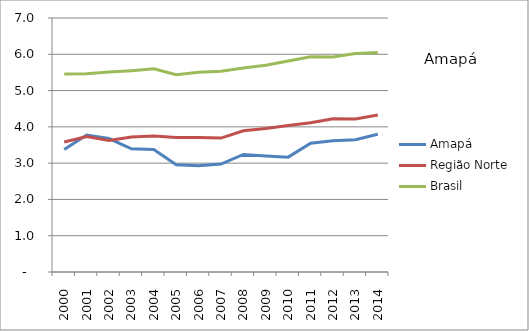
| Category | Amapá | Região Norte | Brasil |
|---|---|---|---|
| 2000.0 | 3.377 | 3.584 | 5.458 |
| 2001.0 | 3.777 | 3.732 | 5.467 |
| 2002.0 | 3.678 | 3.625 | 5.513 |
| 2003.0 | 3.394 | 3.72 | 5.549 |
| 2004.0 | 3.373 | 3.745 | 5.599 |
| 2005.0 | 2.957 | 3.709 | 5.438 |
| 2006.0 | 2.928 | 3.704 | 5.507 |
| 2007.0 | 2.974 | 3.69 | 5.531 |
| 2008.0 | 3.241 | 3.894 | 5.623 |
| 2009.0 | 3.197 | 3.953 | 5.699 |
| 2010.0 | 3.165 | 4.037 | 5.816 |
| 2011.0 | 3.551 | 4.116 | 5.93 |
| 2012.0 | 3.618 | 4.224 | 5.928 |
| 2013.0 | 3.646 | 4.216 | 6.021 |
| 2014.0 | 3.798 | 4.325 | 6.051 |